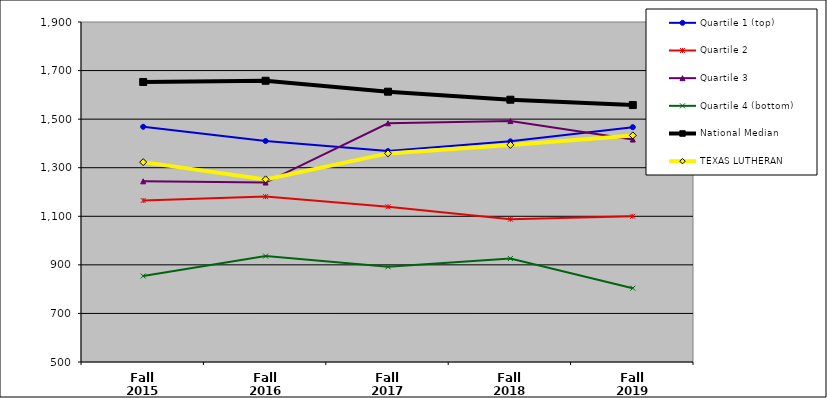
| Category | Quartile 1 (top) | Quartile 2 | Quartile 3 | Quartile 4 (bottom) | National Median | TEXAS LUTHERAN |
|---|---|---|---|---|---|---|
| Fall 2015 | 1468.5 | 1165 | 1244 | 854 | 1653 | 1323 |
| Fall 2016 | 1410 | 1181 | 1239 | 936 | 1658 | 1252 |
| Fall 2017 | 1368.5 | 1139 | 1483 | 892 | 1613 | 1359 |
| Fall 2018 | 1408.5 | 1088 | 1492 | 926 | 1580 | 1394 |
| Fall 2019 | 1467 | 1100 | 1416 | 804 | 1558 | 1433 |